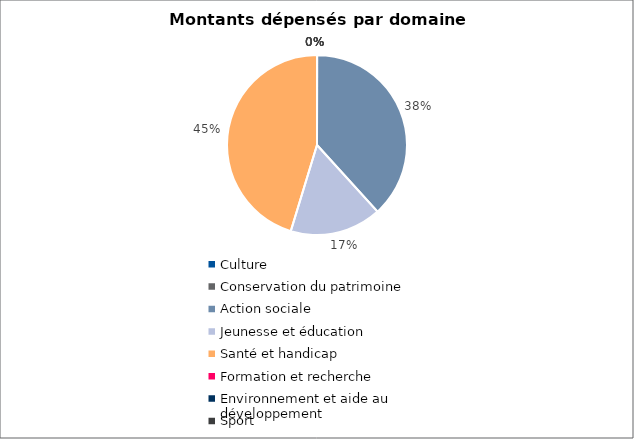
| Category | Series 0 |
|---|---|
| Culture | 0 |
| Conservation du patrimoine | 0 |
| Action sociale | 139534 |
| Jeunesse et éducation | 60000 |
| Santé et handicap | 165256 |
| Formation et recherche | 0 |
| Environnement et aide au
développement | 0 |
| Sport | 0 |
| Autres projets d’utilité publique | 0 |